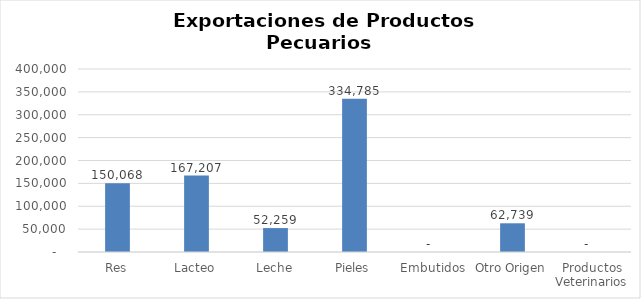
| Category | Kilos |
|---|---|
| Res | 150067.62 |
| Lacteo | 167207.11 |
| Leche | 52258.6 |
| Pieles | 334784.65 |
| Embutidos | 0 |
| Otro Origen | 62738.77 |
| Productos Veterinarios | 0 |